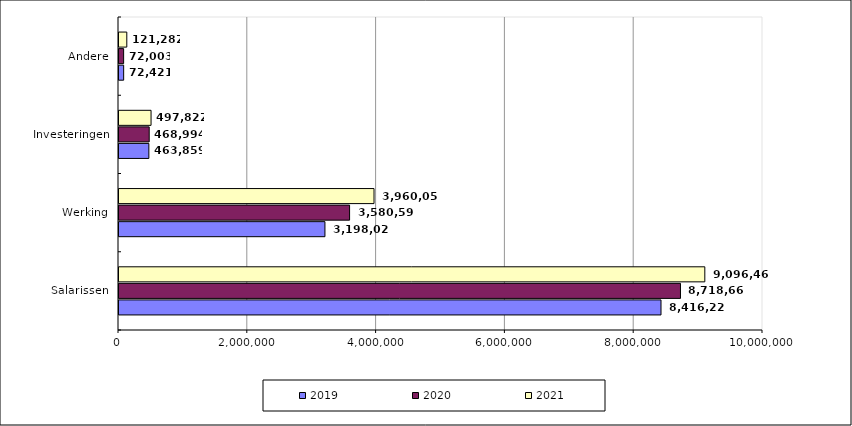
| Category | 2019 | 2020 | 2021 |
|---|---|---|---|
| Salarissen | 8416220 | 8718668 | 9096468 |
| Werking | 3198025 | 3580591.435 | 3960056.881 |
| Investeringen | 463859 | 468994 | 497822 |
| Andere | 72421 | 72003 | 121282 |